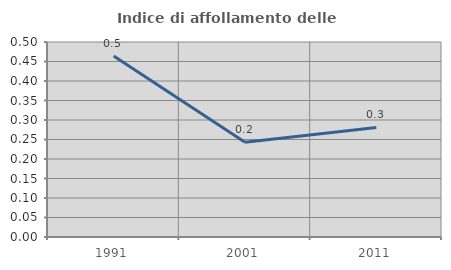
| Category | Indice di affollamento delle abitazioni  |
|---|---|
| 1991.0 | 0.464 |
| 2001.0 | 0.243 |
| 2011.0 | 0.281 |